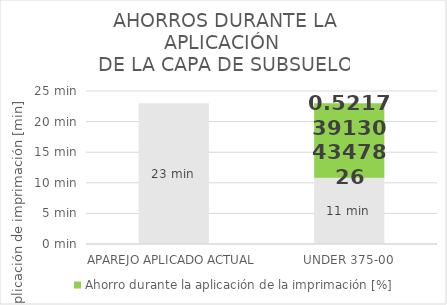
| Category | Tiempo de aplicación de imprimación [min] | Ahorro durante la aplicación de la imprimación [%] |
|---|---|---|
| APAREJO APLICADO ACTUAL | 23 | 0 |
| UNDER 375-00 | 11 | 12 |